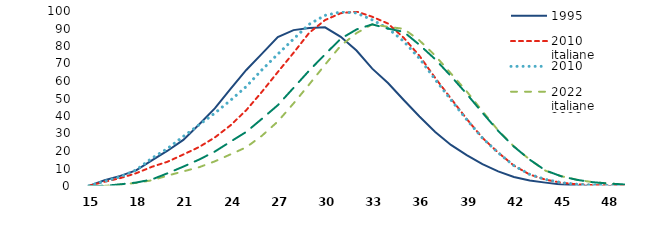
| Category | 1995 | 2010  italiane | 2010 | 2022 italiane | 2022 |
|---|---|---|---|---|---|
| 15.0 | 0.095 | 0.103 | 0.11 | 0.024 | 0.036 |
| 16.0 | 3.259 | 2.418 | 2.727 | 0.063 | 0.082 |
| 17.0 | 5.793 | 4.523 | 5.251 | 0.821 | 0.953 |
| 18.0 | 8.886 | 7.28 | 9.16 | 1.765 | 1.964 |
| 19.0 | 14.616 | 10.955 | 15.862 | 3.257 | 3.723 |
| 20.0 | 20.164 | 13.872 | 21.418 | 5.937 | 7.283 |
| 21.0 | 26.346 | 17.998 | 28.323 | 8.37 | 11.072 |
| 22.0 | 35.108 | 22.257 | 34.958 | 10.714 | 15.085 |
| 23.0 | 44.355 | 27.723 | 41.634 | 14.081 | 19.677 |
| 24.0 | 55.441 | 34.682 | 48.993 | 18.095 | 25.351 |
| 25.0 | 66.314 | 43.351 | 56.846 | 22.14 | 30.95 |
| 26.0 | 75.613 | 53.906 | 66.435 | 28.78 | 38.456 |
| 27.0 | 85.073 | 65.114 | 75.339 | 36.839 | 46.175 |
| 28.0 | 89.077 | 76.09 | 83.982 | 47.189 | 56.07 |
| 29.0 | 90.318 | 87.582 | 92.458 | 58.091 | 66.001 |
| 30.0 | 90.687 | 94.807 | 97.495 | 69.31 | 75.219 |
| 31.0 | 85.274 | 98.743 | 99.44 | 80.197 | 84.162 |
| 32.0 | 77.401 | 99.709 | 98.877 | 87.381 | 89.453 |
| 33.0 | 67.076 | 96.707 | 94.908 | 92.384 | 92.36 |
| 34.0 | 58.83 | 92.829 | 90.057 | 90.959 | 89.951 |
| 35.0 | 49.12 | 84.688 | 82.672 | 89.8 | 88.078 |
| 36.0 | 39.721 | 74.343 | 72.872 | 83.173 | 80.641 |
| 37.0 | 30.828 | 61.761 | 60.854 | 74.514 | 72.431 |
| 38.0 | 23.467 | 49.968 | 49.208 | 64.283 | 62.772 |
| 39.0 | 17.652 | 38.304 | 37.92 | 54.069 | 52.611 |
| 40.0 | 12.499 | 27.517 | 27.388 | 42.737 | 41.866 |
| 41.0 | 8.371 | 19.126 | 18.973 | 31.762 | 31.493 |
| 42.0 | 5.187 | 11.654 | 11.631 | 22.637 | 22.496 |
| 43.0 | 3.195 | 6.563 | 6.643 | 15.109 | 15.083 |
| 44.0 | 1.93 | 3.646 | 3.772 | 8.757 | 8.896 |
| 45.0 | 0.818 | 1.895 | 1.932 | 5.617 | 5.57 |
| 46.0 | 0.295 | 0.967 | 0.987 | 3.58 | 3.526 |
| 47.0 | 0.17 | 0.553 | 0.552 | 2.206 | 2.169 |
| 48.0 | 0.049 | 0.303 | 0.291 | 1.443 | 1.411 |
| 49.0 | 0.014 | 0.192 | 0.19 | 0.899 | 0.88 |